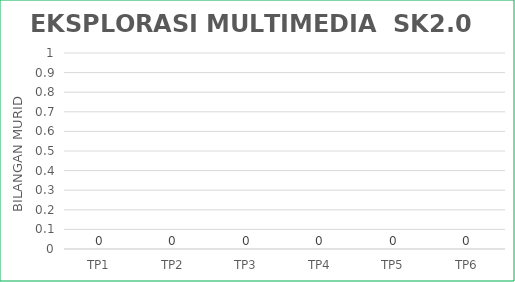
| Category | Series 0 |
|---|---|
| TP1 | 0 |
| TP2 | 0 |
| TP3 | 0 |
| TP4 | 0 |
| TP5 | 0 |
| TP6 | 0 |